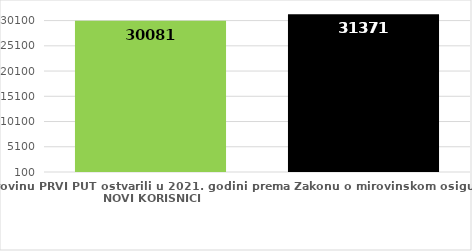
| Category | broj korisnika |
|---|---|
| Korisnici koji su pravo na mirovinu PRVI PUT ostvarili u 2021. godini prema Zakonu o mirovinskom osiguranju - NOVI KORISNICI | 30081 |
| Korisnici mirovina kojima je u 2021. godini PRESTALO PRAVO NA MIROVINU - uzrok smrt 
koji su pravo na mirovinu ostvarili prema Zakonu o mirovinskom osiguranju | 31371 |